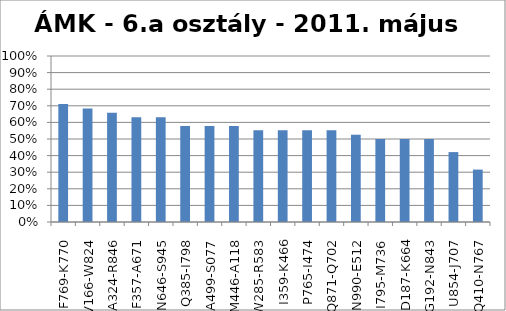
| Category | eredmények |
|---|---|
| F769-K770 | 0.711 |
| V166-W824 | 0.684 |
| A324-R846 | 0.658 |
| F357-A671 | 0.632 |
| N646-S945 | 0.632 |
| Q385-I798 | 0.579 |
| A499-S077 | 0.579 |
| M446-A118 | 0.579 |
| W285-R583 | 0.553 |
| I359-K466 | 0.553 |
| P765-I474 | 0.553 |
| Q871-Q702 | 0.553 |
| N990-E512 | 0.526 |
| I795-M736 | 0.5 |
| D187-K664 | 0.5 |
| G192-N843 | 0.5 |
| U854-J707 | 0.421 |
| Q410-N767 | 0.316 |